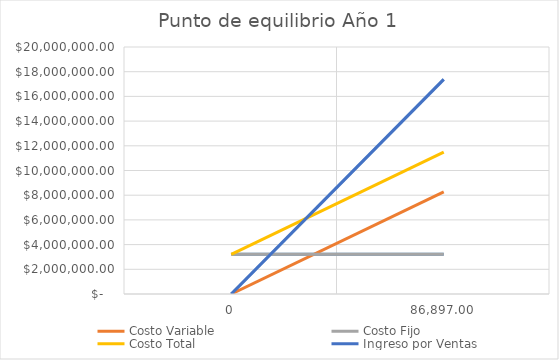
| Category | Costo Fijo | Ingreso por Ventas | Costo Variable | Costo Total |
|---|---|---|---|---|
| 0.0 | 3213880.667 | 0 | 0 | 3213880.667 |
| 86897.0 | 3213880.667 | 17379400 | 8270926.017 | 11484806.683 |